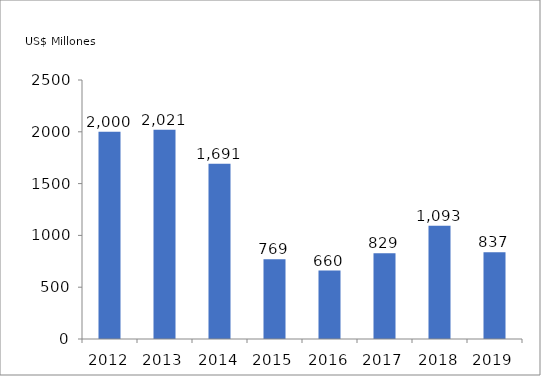
| Category | Series 0 |
|---|---|
| 2012.0 | 1999.78 |
| 2013.0 | 2020.94 |
| 2014.0 | 1690.63 |
| 2015.0 | 768.961 |
| 2016.0 | 660.255 |
| 2017.0 | 828.83 |
| 2018.0 | 1092.93 |
| 2019.0 | 837.19 |